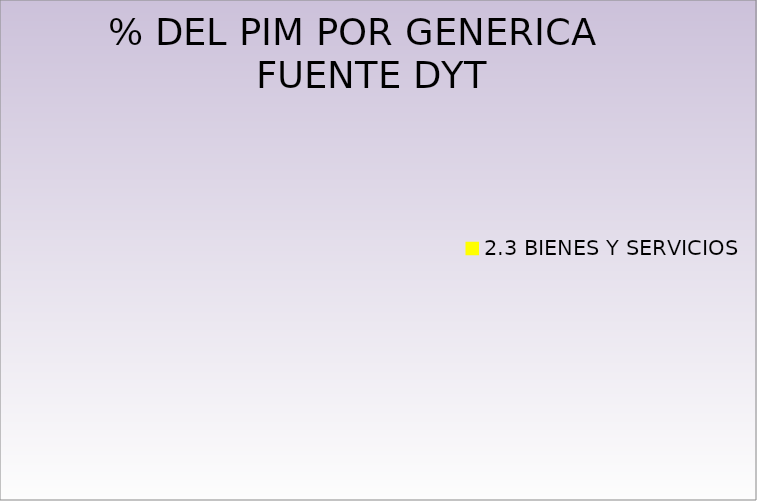
| Category | Series 0 |
|---|---|
| 2.3 BIENES Y SERVICIOS | 0 |